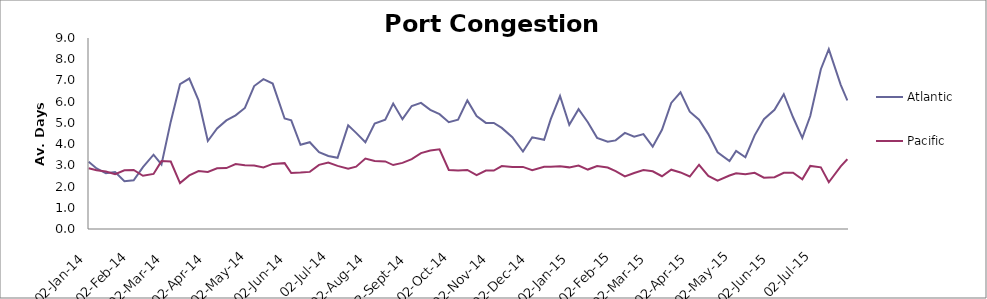
| Category | Atlantic  | Pacific |
|---|---|---|
| 2014-01-02 | 3.167 | 2.863 |
| 2014-01-08 | 2.854 | 2.767 |
| 2014-01-15 | 2.625 | 2.712 |
| 2014-01-22 | 2.688 | 2.582 |
| 2014-01-29 | 2.25 | 2.767 |
| 2014-02-05 | 2.292 | 2.781 |
| 2014-02-12 | 2.917 | 2.507 |
| 2014-02-20 | 3.5 | 2.596 |
| 2014-02-26 | 3.042 | 3.199 |
| 2014-03-05 | 5.059 | 3.178 |
| 2014-03-12 | 6.824 | 2.164 |
| 2014-03-19 | 7.088 | 2.527 |
| 2014-03-26 | 6.059 | 2.733 |
| 2014-04-02 | 4.147 | 2.692 |
| 2014-04-09 | 4.735 | 2.863 |
| 2014-04-16 | 5.118 | 2.87 |
| 2014-04-23 | 5.353 | 3.062 |
| 2014-04-30 | 5.706 | 3 |
| 2014-05-07 | 6.735 | 2.993 |
| 2014-05-14 | 7.059 | 2.904 |
| 2014-05-21 | 6.853 | 3.068 |
| 2014-05-30 | 5.206 | 3.103 |
| 2014-06-04 | 5.118 | 2.637 |
| 2014-06-11 | 3.971 | 2.658 |
| 2014-06-18 | 4.088 | 2.692 |
| 2014-06-25 | 3.618 | 3.021 |
| 2014-07-02 | 3.441 | 3.13 |
| 2014-07-09 | 3.353 | 2.973 |
| 2014-07-17 | 4.882 | 2.836 |
| 2014-07-23 | 4.529 | 2.938 |
| 2014-07-30 | 4.088 | 3.322 |
| 2014-08-06 | 4.971 | 3.205 |
| 2014-08-14 | 5.147 | 3.185 |
| 2014-08-20 | 5.912 | 3.014 |
| 2014-08-27 | 5.176 | 3.116 |
| 2014-09-03 | 5.794 | 3.295 |
| 2014-09-10 | 5.941 | 3.575 |
| 2014-09-17 | 5.618 | 3.699 |
| 2014-09-24 | 5.412 | 3.753 |
| 2014-10-01 | 5.029 | 2.781 |
| 2014-10-08 | 5.147 | 2.753 |
| 2014-10-15 | 6.059 | 2.785 |
| 2014-10-22 | 5.324 | 2.541 |
| 2014-10-29 | 5 | 2.753 |
| 2014-11-04 | 5 | 2.753 |
| 2014-11-10 | 4.765 | 2.966 |
| 2014-11-18 | 4.324 | 2.918 |
| 2014-11-26 | 3.647 | 2.925 |
| 2014-12-03 | 4.324 | 2.767 |
| 2014-12-12 | 4.206 | 2.932 |
| 2014-12-17 | 5.176 | 2.938 |
| 2014-12-24 | 6.265 | 2.952 |
| 2014-12-31 | 4.912 | 2.904 |
| 2015-01-07 | 5.647 | 2.993 |
| 2015-01-14 | 5.029 | 2.801 |
| 2015-01-21 | 4.294 | 2.966 |
| 2015-01-29 | 4.118 | 2.897 |
| 2015-02-04 | 4.176 | 2.726 |
| 2015-02-11 | 4.529 | 2.479 |
| 2015-02-18 | 4.353 | 2.637 |
| 2015-02-25 | 4.471 | 2.774 |
| 2015-03-04 | 3.882 | 2.719 |
| 2015-03-11 | 4.676 | 2.486 |
| 2015-03-18 | 5.941 | 2.795 |
| 2015-03-25 | 6.441 | 2.664 |
| 2015-04-01 | 5.529 | 2.473 |
| 2015-04-08 | 5.147 | 3.027 |
| 2015-04-15 | 4.471 | 2.5 |
| 2015-04-22 | 3.618 | 2.274 |
| 2015-05-01 | 3.206 | 2.521 |
| 2015-05-06 | 3.676 | 2.63 |
| 2015-05-13 | 3.382 | 2.575 |
| 2015-05-20 | 4.412 | 2.651 |
| 2015-05-27 | 5.176 | 2.418 |
| 2015-06-04 | 5.618 | 2.442 |
| 2015-06-11 | 6.353 | 2.645 |
| 2015-06-18 | 5.265 | 2.651 |
| 2015-06-25 | 4.294 | 2.342 |
| 2015-07-01 | 5.324 | 2.973 |
| 2015-07-09 | 7.529 | 2.904 |
| 2015-07-15 | 8.471 | 2.203 |
| 2015-07-24 | 6.794 | 2.952 |
| 2015-07-29 | 6.059 | 3.288 |